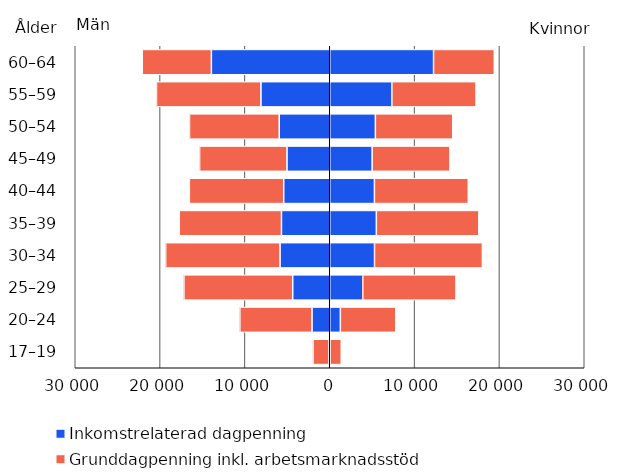
| Category | Series 0 | Series 1 | Inkomstrelaterad dagpenning | Grunddagpenning inkl. arbetsmarknadsstöd |
|---|---|---|---|---|
| 17–19 | -90 | -1875 | 32 | 1323 |
| 20–24 | -2091 | -8506 | 1249 | 6545 |
| 25–29 | -4364 | -12827 | 3892 | 10991 |
| 30–34 | -5861 | -13483 | 5277 | 12715 |
| 35–39 | -5691 | -12048 | 5491 | 12084 |
| 40–44 | -5426 | -11122 | 5267 | 11061 |
| 45–49 | -5040 | -10301 | 4997 | 9171 |
| 50–54 | -5956 | -10576 | 5377 | 9117 |
| 55–59 | -8112 | -12311 | 7322 | 9924 |
| 60–64 | -13952 | -8147 | 12236 | 7160 |